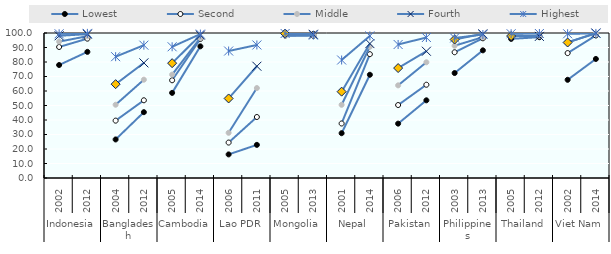
| Category | Lowest | Second | Middle | Fourth | Highest |
|---|---|---|---|---|---|
| 0 | 77.921 | 90.352 | 94.055 | 98.09 | 99.469 |
| 1 | 86.995 | 96.11 | 97.805 | 99.195 | 99.743 |
| 2 | 26.583 | 39.569 | 50.533 | 64.711 | 83.67 |
| 3 | 45.4 | 53.6 | 67.8 | 79.4 | 91.6 |
| 4 | 58.7 | 67.4 | 71.3 | 79.2 | 90.5 |
| 5 | 90.795 | 95.929 | 96.57 | 98.555 | 99.255 |
| 6 | 16.268 | 24.444 | 31.182 | 54.859 | 87.569 |
| 7 | 22.853 | 42.065 | 62.026 | 77.09 | 91.744 |
| 8 | 98.741 | 98.165 | 98.201 | 99.605 | 99.665 |
| 9 | 99.311 | 98.072 | 98.616 | 99.12 | 98.54 |
| 10 | 30.892 | 37.594 | 50.485 | 59.549 | 81.372 |
| 11 | 71.2 | 85.4 | 90.5 | 92.7 | 98 |
| 12 | 37.494 | 50.32 | 63.901 | 75.829 | 92.079 |
| 13 | 53.573 | 64.322 | 79.807 | 87.423 | 96.89 |
| 14 | 72.39 | 86.73 | 91.237 | 95.507 | 96.553 |
| 15 | 88.044 | 96.354 | 97.124 | 99.424 | 98.945 |
| 16 | 95.962 | 98.046 | 97.845 | 97.912 | 99.502 |
| 17 | 97.112 | 98.141 | 97.914 | 97.67 | 99.655 |
| 18 | 67.722 | 86.147 | 93.57 | 93.447 | 99.462 |
| 19 | 82.1 | 98.294 | 99.698 | 100 | 99.706 |